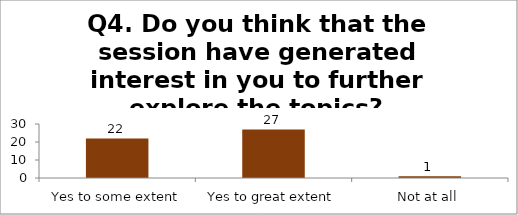
| Category | Q4. Do you think that the session have generated interest in you to further explore the topics? |
|---|---|
| Yes to some extent | 22 |
| Yes to great extent | 27 |
| Not at all | 1 |